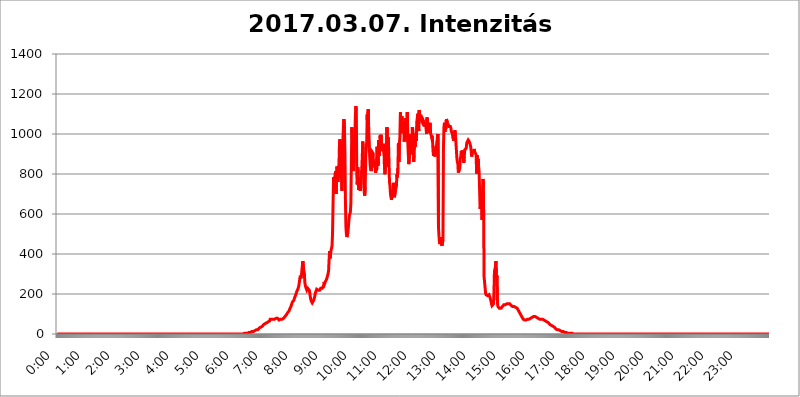
| Category | 2017.03.07. Intenzitás [W/m^2]07 |
|---|---|
| 0.0 | 0 |
| 0.0006944444444444445 | 0 |
| 0.001388888888888889 | 0 |
| 0.0020833333333333333 | 0 |
| 0.002777777777777778 | 0 |
| 0.003472222222222222 | 0 |
| 0.004166666666666667 | 0 |
| 0.004861111111111111 | 0 |
| 0.005555555555555556 | 0 |
| 0.0062499999999999995 | 0 |
| 0.006944444444444444 | 0 |
| 0.007638888888888889 | 0 |
| 0.008333333333333333 | 0 |
| 0.009027777777777779 | 0 |
| 0.009722222222222222 | 0 |
| 0.010416666666666666 | 0 |
| 0.011111111111111112 | 0 |
| 0.011805555555555555 | 0 |
| 0.012499999999999999 | 0 |
| 0.013194444444444444 | 0 |
| 0.013888888888888888 | 0 |
| 0.014583333333333332 | 0 |
| 0.015277777777777777 | 0 |
| 0.015972222222222224 | 0 |
| 0.016666666666666666 | 0 |
| 0.017361111111111112 | 0 |
| 0.018055555555555557 | 0 |
| 0.01875 | 0 |
| 0.019444444444444445 | 0 |
| 0.02013888888888889 | 0 |
| 0.020833333333333332 | 0 |
| 0.02152777777777778 | 0 |
| 0.022222222222222223 | 0 |
| 0.02291666666666667 | 0 |
| 0.02361111111111111 | 0 |
| 0.024305555555555556 | 0 |
| 0.024999999999999998 | 0 |
| 0.025694444444444447 | 0 |
| 0.02638888888888889 | 0 |
| 0.027083333333333334 | 0 |
| 0.027777777777777776 | 0 |
| 0.02847222222222222 | 0 |
| 0.029166666666666664 | 0 |
| 0.029861111111111113 | 0 |
| 0.030555555555555555 | 0 |
| 0.03125 | 0 |
| 0.03194444444444445 | 0 |
| 0.03263888888888889 | 0 |
| 0.03333333333333333 | 0 |
| 0.034027777777777775 | 0 |
| 0.034722222222222224 | 0 |
| 0.035416666666666666 | 0 |
| 0.036111111111111115 | 0 |
| 0.03680555555555556 | 0 |
| 0.0375 | 0 |
| 0.03819444444444444 | 0 |
| 0.03888888888888889 | 0 |
| 0.03958333333333333 | 0 |
| 0.04027777777777778 | 0 |
| 0.04097222222222222 | 0 |
| 0.041666666666666664 | 0 |
| 0.042361111111111106 | 0 |
| 0.04305555555555556 | 0 |
| 0.043750000000000004 | 0 |
| 0.044444444444444446 | 0 |
| 0.04513888888888889 | 0 |
| 0.04583333333333334 | 0 |
| 0.04652777777777778 | 0 |
| 0.04722222222222222 | 0 |
| 0.04791666666666666 | 0 |
| 0.04861111111111111 | 0 |
| 0.049305555555555554 | 0 |
| 0.049999999999999996 | 0 |
| 0.05069444444444445 | 0 |
| 0.051388888888888894 | 0 |
| 0.052083333333333336 | 0 |
| 0.05277777777777778 | 0 |
| 0.05347222222222222 | 0 |
| 0.05416666666666667 | 0 |
| 0.05486111111111111 | 0 |
| 0.05555555555555555 | 0 |
| 0.05625 | 0 |
| 0.05694444444444444 | 0 |
| 0.057638888888888885 | 0 |
| 0.05833333333333333 | 0 |
| 0.05902777777777778 | 0 |
| 0.059722222222222225 | 0 |
| 0.06041666666666667 | 0 |
| 0.061111111111111116 | 0 |
| 0.06180555555555556 | 0 |
| 0.0625 | 0 |
| 0.06319444444444444 | 0 |
| 0.06388888888888888 | 0 |
| 0.06458333333333334 | 0 |
| 0.06527777777777778 | 0 |
| 0.06597222222222222 | 0 |
| 0.06666666666666667 | 0 |
| 0.06736111111111111 | 0 |
| 0.06805555555555555 | 0 |
| 0.06874999999999999 | 0 |
| 0.06944444444444443 | 0 |
| 0.07013888888888889 | 0 |
| 0.07083333333333333 | 0 |
| 0.07152777777777779 | 0 |
| 0.07222222222222223 | 0 |
| 0.07291666666666667 | 0 |
| 0.07361111111111111 | 0 |
| 0.07430555555555556 | 0 |
| 0.075 | 0 |
| 0.07569444444444444 | 0 |
| 0.0763888888888889 | 0 |
| 0.07708333333333334 | 0 |
| 0.07777777777777778 | 0 |
| 0.07847222222222222 | 0 |
| 0.07916666666666666 | 0 |
| 0.0798611111111111 | 0 |
| 0.08055555555555556 | 0 |
| 0.08125 | 0 |
| 0.08194444444444444 | 0 |
| 0.08263888888888889 | 0 |
| 0.08333333333333333 | 0 |
| 0.08402777777777777 | 0 |
| 0.08472222222222221 | 0 |
| 0.08541666666666665 | 0 |
| 0.08611111111111112 | 0 |
| 0.08680555555555557 | 0 |
| 0.08750000000000001 | 0 |
| 0.08819444444444445 | 0 |
| 0.08888888888888889 | 0 |
| 0.08958333333333333 | 0 |
| 0.09027777777777778 | 0 |
| 0.09097222222222222 | 0 |
| 0.09166666666666667 | 0 |
| 0.09236111111111112 | 0 |
| 0.09305555555555556 | 0 |
| 0.09375 | 0 |
| 0.09444444444444444 | 0 |
| 0.09513888888888888 | 0 |
| 0.09583333333333333 | 0 |
| 0.09652777777777777 | 0 |
| 0.09722222222222222 | 0 |
| 0.09791666666666667 | 0 |
| 0.09861111111111111 | 0 |
| 0.09930555555555555 | 0 |
| 0.09999999999999999 | 0 |
| 0.10069444444444443 | 0 |
| 0.1013888888888889 | 0 |
| 0.10208333333333335 | 0 |
| 0.10277777777777779 | 0 |
| 0.10347222222222223 | 0 |
| 0.10416666666666667 | 0 |
| 0.10486111111111111 | 0 |
| 0.10555555555555556 | 0 |
| 0.10625 | 0 |
| 0.10694444444444444 | 0 |
| 0.1076388888888889 | 0 |
| 0.10833333333333334 | 0 |
| 0.10902777777777778 | 0 |
| 0.10972222222222222 | 0 |
| 0.1111111111111111 | 0 |
| 0.11180555555555556 | 0 |
| 0.11180555555555556 | 0 |
| 0.1125 | 0 |
| 0.11319444444444444 | 0 |
| 0.11388888888888889 | 0 |
| 0.11458333333333333 | 0 |
| 0.11527777777777777 | 0 |
| 0.11597222222222221 | 0 |
| 0.11666666666666665 | 0 |
| 0.1173611111111111 | 0 |
| 0.11805555555555557 | 0 |
| 0.11944444444444445 | 0 |
| 0.12013888888888889 | 0 |
| 0.12083333333333333 | 0 |
| 0.12152777777777778 | 0 |
| 0.12222222222222223 | 0 |
| 0.12291666666666667 | 0 |
| 0.12291666666666667 | 0 |
| 0.12361111111111112 | 0 |
| 0.12430555555555556 | 0 |
| 0.125 | 0 |
| 0.12569444444444444 | 0 |
| 0.12638888888888888 | 0 |
| 0.12708333333333333 | 0 |
| 0.16875 | 0 |
| 0.12847222222222224 | 0 |
| 0.12916666666666668 | 0 |
| 0.12986111111111112 | 0 |
| 0.13055555555555556 | 0 |
| 0.13125 | 0 |
| 0.13194444444444445 | 0 |
| 0.1326388888888889 | 0 |
| 0.13333333333333333 | 0 |
| 0.13402777777777777 | 0 |
| 0.13402777777777777 | 0 |
| 0.13472222222222222 | 0 |
| 0.13541666666666666 | 0 |
| 0.1361111111111111 | 0 |
| 0.13749999999999998 | 0 |
| 0.13819444444444443 | 0 |
| 0.1388888888888889 | 0 |
| 0.13958333333333334 | 0 |
| 0.14027777777777778 | 0 |
| 0.14097222222222222 | 0 |
| 0.14166666666666666 | 0 |
| 0.1423611111111111 | 0 |
| 0.14305555555555557 | 0 |
| 0.14375000000000002 | 0 |
| 0.14444444444444446 | 0 |
| 0.1451388888888889 | 0 |
| 0.1451388888888889 | 0 |
| 0.14652777777777778 | 0 |
| 0.14722222222222223 | 0 |
| 0.14791666666666667 | 0 |
| 0.1486111111111111 | 0 |
| 0.14930555555555555 | 0 |
| 0.15 | 0 |
| 0.15069444444444444 | 0 |
| 0.15138888888888888 | 0 |
| 0.15208333333333332 | 0 |
| 0.15277777777777776 | 0 |
| 0.15347222222222223 | 0 |
| 0.15416666666666667 | 0 |
| 0.15486111111111112 | 0 |
| 0.15555555555555556 | 0 |
| 0.15625 | 0 |
| 0.15694444444444444 | 0 |
| 0.15763888888888888 | 0 |
| 0.15833333333333333 | 0 |
| 0.15902777777777777 | 0 |
| 0.15972222222222224 | 0 |
| 0.16041666666666668 | 0 |
| 0.16111111111111112 | 0 |
| 0.16180555555555556 | 0 |
| 0.1625 | 0 |
| 0.16319444444444445 | 0 |
| 0.1638888888888889 | 0 |
| 0.16458333333333333 | 0 |
| 0.16527777777777777 | 0 |
| 0.16597222222222222 | 0 |
| 0.16666666666666666 | 0 |
| 0.1673611111111111 | 0 |
| 0.16805555555555554 | 0 |
| 0.16874999999999998 | 0 |
| 0.16944444444444443 | 0 |
| 0.17013888888888887 | 0 |
| 0.1708333333333333 | 0 |
| 0.17152777777777775 | 0 |
| 0.17222222222222225 | 0 |
| 0.1729166666666667 | 0 |
| 0.17361111111111113 | 0 |
| 0.17430555555555557 | 0 |
| 0.17500000000000002 | 0 |
| 0.17569444444444446 | 0 |
| 0.1763888888888889 | 0 |
| 0.17708333333333334 | 0 |
| 0.17777777777777778 | 0 |
| 0.17847222222222223 | 0 |
| 0.17916666666666667 | 0 |
| 0.1798611111111111 | 0 |
| 0.18055555555555555 | 0 |
| 0.18125 | 0 |
| 0.18194444444444444 | 0 |
| 0.1826388888888889 | 0 |
| 0.18333333333333335 | 0 |
| 0.1840277777777778 | 0 |
| 0.18472222222222223 | 0 |
| 0.18541666666666667 | 0 |
| 0.18611111111111112 | 0 |
| 0.18680555555555556 | 0 |
| 0.1875 | 0 |
| 0.18819444444444444 | 0 |
| 0.18888888888888888 | 0 |
| 0.18958333333333333 | 0 |
| 0.19027777777777777 | 0 |
| 0.1909722222222222 | 0 |
| 0.19166666666666665 | 0 |
| 0.19236111111111112 | 0 |
| 0.19305555555555554 | 0 |
| 0.19375 | 0 |
| 0.19444444444444445 | 0 |
| 0.1951388888888889 | 0 |
| 0.19583333333333333 | 0 |
| 0.19652777777777777 | 0 |
| 0.19722222222222222 | 0 |
| 0.19791666666666666 | 0 |
| 0.1986111111111111 | 0 |
| 0.19930555555555554 | 0 |
| 0.19999999999999998 | 0 |
| 0.20069444444444443 | 0 |
| 0.20138888888888887 | 0 |
| 0.2020833333333333 | 0 |
| 0.2027777777777778 | 0 |
| 0.2034722222222222 | 0 |
| 0.2041666666666667 | 0 |
| 0.20486111111111113 | 0 |
| 0.20555555555555557 | 0 |
| 0.20625000000000002 | 0 |
| 0.20694444444444446 | 0 |
| 0.2076388888888889 | 0 |
| 0.20833333333333334 | 0 |
| 0.20902777777777778 | 0 |
| 0.20972222222222223 | 0 |
| 0.21041666666666667 | 0 |
| 0.2111111111111111 | 0 |
| 0.21180555555555555 | 0 |
| 0.2125 | 0 |
| 0.21319444444444444 | 0 |
| 0.2138888888888889 | 0 |
| 0.21458333333333335 | 0 |
| 0.2152777777777778 | 0 |
| 0.21597222222222223 | 0 |
| 0.21666666666666667 | 0 |
| 0.21736111111111112 | 0 |
| 0.21805555555555556 | 0 |
| 0.21875 | 0 |
| 0.21944444444444444 | 0 |
| 0.22013888888888888 | 0 |
| 0.22083333333333333 | 0 |
| 0.22152777777777777 | 0 |
| 0.2222222222222222 | 0 |
| 0.22291666666666665 | 0 |
| 0.2236111111111111 | 0 |
| 0.22430555555555556 | 0 |
| 0.225 | 0 |
| 0.22569444444444445 | 0 |
| 0.2263888888888889 | 0 |
| 0.22708333333333333 | 0 |
| 0.22777777777777777 | 0 |
| 0.22847222222222222 | 0 |
| 0.22916666666666666 | 0 |
| 0.2298611111111111 | 0 |
| 0.23055555555555554 | 0 |
| 0.23124999999999998 | 0 |
| 0.23194444444444443 | 0 |
| 0.23263888888888887 | 0 |
| 0.2333333333333333 | 0 |
| 0.2340277777777778 | 0 |
| 0.2347222222222222 | 0 |
| 0.2354166666666667 | 0 |
| 0.23611111111111113 | 0 |
| 0.23680555555555557 | 0 |
| 0.23750000000000002 | 0 |
| 0.23819444444444446 | 0 |
| 0.2388888888888889 | 0 |
| 0.23958333333333334 | 0 |
| 0.24027777777777778 | 0 |
| 0.24097222222222223 | 0 |
| 0.24166666666666667 | 0 |
| 0.2423611111111111 | 0 |
| 0.24305555555555555 | 0 |
| 0.24375 | 0 |
| 0.24444444444444446 | 0 |
| 0.24513888888888888 | 0 |
| 0.24583333333333335 | 0 |
| 0.2465277777777778 | 0 |
| 0.24722222222222223 | 0 |
| 0.24791666666666667 | 0 |
| 0.24861111111111112 | 0 |
| 0.24930555555555556 | 0 |
| 0.25 | 0 |
| 0.25069444444444444 | 0 |
| 0.2513888888888889 | 0 |
| 0.2520833333333333 | 0 |
| 0.25277777777777777 | 0 |
| 0.2534722222222222 | 0 |
| 0.25416666666666665 | 0 |
| 0.2548611111111111 | 0 |
| 0.2555555555555556 | 0 |
| 0.25625000000000003 | 0 |
| 0.2569444444444445 | 0 |
| 0.2576388888888889 | 0 |
| 0.25833333333333336 | 0 |
| 0.2590277777777778 | 0 |
| 0.25972222222222224 | 0 |
| 0.2604166666666667 | 0 |
| 0.2611111111111111 | 0 |
| 0.26180555555555557 | 0 |
| 0.2625 | 3.525 |
| 0.26319444444444445 | 3.525 |
| 0.2638888888888889 | 3.525 |
| 0.26458333333333334 | 3.525 |
| 0.2652777777777778 | 3.525 |
| 0.2659722222222222 | 3.525 |
| 0.26666666666666666 | 3.525 |
| 0.2673611111111111 | 7.887 |
| 0.26805555555555555 | 7.887 |
| 0.26875 | 7.887 |
| 0.26944444444444443 | 7.887 |
| 0.2701388888888889 | 7.887 |
| 0.2708333333333333 | 7.887 |
| 0.27152777777777776 | 7.887 |
| 0.2722222222222222 | 7.887 |
| 0.27291666666666664 | 12.257 |
| 0.2736111111111111 | 12.257 |
| 0.2743055555555555 | 12.257 |
| 0.27499999999999997 | 12.257 |
| 0.27569444444444446 | 12.257 |
| 0.27638888888888885 | 12.257 |
| 0.27708333333333335 | 16.636 |
| 0.2777777777777778 | 16.636 |
| 0.27847222222222223 | 16.636 |
| 0.2791666666666667 | 21.024 |
| 0.2798611111111111 | 21.024 |
| 0.28055555555555556 | 21.024 |
| 0.28125 | 21.024 |
| 0.28194444444444444 | 25.419 |
| 0.2826388888888889 | 25.419 |
| 0.2833333333333333 | 29.823 |
| 0.28402777777777777 | 29.823 |
| 0.2847222222222222 | 29.823 |
| 0.28541666666666665 | 34.234 |
| 0.28611111111111115 | 34.234 |
| 0.28680555555555554 | 38.653 |
| 0.28750000000000003 | 38.653 |
| 0.2881944444444445 | 43.079 |
| 0.2888888888888889 | 43.079 |
| 0.28958333333333336 | 47.511 |
| 0.2902777777777778 | 47.511 |
| 0.29097222222222224 | 47.511 |
| 0.2916666666666667 | 51.951 |
| 0.2923611111111111 | 51.951 |
| 0.29305555555555557 | 56.398 |
| 0.29375 | 56.398 |
| 0.29444444444444445 | 56.398 |
| 0.2951388888888889 | 60.85 |
| 0.29583333333333334 | 60.85 |
| 0.2965277777777778 | 60.85 |
| 0.2972222222222222 | 65.31 |
| 0.29791666666666666 | 65.31 |
| 0.2986111111111111 | 74.246 |
| 0.29930555555555555 | 78.722 |
| 0.3 | 78.722 |
| 0.30069444444444443 | 74.246 |
| 0.3013888888888889 | 74.246 |
| 0.3020833333333333 | 74.246 |
| 0.30277777777777776 | 74.246 |
| 0.3034722222222222 | 74.246 |
| 0.30416666666666664 | 74.246 |
| 0.3048611111111111 | 74.246 |
| 0.3055555555555555 | 74.246 |
| 0.30624999999999997 | 74.246 |
| 0.3069444444444444 | 78.722 |
| 0.3076388888888889 | 78.722 |
| 0.30833333333333335 | 78.722 |
| 0.3090277777777778 | 78.722 |
| 0.30972222222222223 | 83.205 |
| 0.3104166666666667 | 74.246 |
| 0.3111111111111111 | 69.775 |
| 0.31180555555555556 | 69.775 |
| 0.3125 | 69.775 |
| 0.31319444444444444 | 74.246 |
| 0.3138888888888889 | 74.246 |
| 0.3145833333333333 | 74.246 |
| 0.31527777777777777 | 74.246 |
| 0.3159722222222222 | 74.246 |
| 0.31666666666666665 | 74.246 |
| 0.31736111111111115 | 78.722 |
| 0.31805555555555554 | 83.205 |
| 0.31875000000000003 | 83.205 |
| 0.3194444444444445 | 87.692 |
| 0.3201388888888889 | 92.184 |
| 0.32083333333333336 | 92.184 |
| 0.3215277777777778 | 96.682 |
| 0.32222222222222224 | 101.184 |
| 0.3229166666666667 | 105.69 |
| 0.3236111111111111 | 105.69 |
| 0.32430555555555557 | 110.201 |
| 0.325 | 114.716 |
| 0.32569444444444445 | 119.235 |
| 0.3263888888888889 | 128.284 |
| 0.32708333333333334 | 132.814 |
| 0.3277777777777778 | 137.347 |
| 0.3284722222222222 | 146.423 |
| 0.32916666666666666 | 150.964 |
| 0.3298611111111111 | 160.056 |
| 0.33055555555555555 | 164.605 |
| 0.33125 | 164.605 |
| 0.33194444444444443 | 169.156 |
| 0.3326388888888889 | 178.264 |
| 0.3333333333333333 | 182.82 |
| 0.3340277777777778 | 191.937 |
| 0.3347222222222222 | 196.497 |
| 0.3354166666666667 | 205.62 |
| 0.3361111111111111 | 214.746 |
| 0.3368055555555556 | 219.309 |
| 0.33749999999999997 | 223.873 |
| 0.33819444444444446 | 228.436 |
| 0.33888888888888885 | 242.127 |
| 0.33958333333333335 | 260.373 |
| 0.34027777777777773 | 278.603 |
| 0.34097222222222223 | 292.259 |
| 0.3416666666666666 | 278.603 |
| 0.3423611111111111 | 287.709 |
| 0.3430555555555555 | 314.98 |
| 0.34375 | 342.162 |
| 0.3444444444444445 | 364.728 |
| 0.3451388888888889 | 342.162 |
| 0.3458333333333334 | 314.98 |
| 0.34652777777777777 | 305.898 |
| 0.34722222222222227 | 260.373 |
| 0.34791666666666665 | 242.127 |
| 0.34861111111111115 | 233 |
| 0.34930555555555554 | 228.436 |
| 0.35000000000000003 | 219.309 |
| 0.3506944444444444 | 219.309 |
| 0.3513888888888889 | 228.436 |
| 0.3520833333333333 | 233 |
| 0.3527777777777778 | 228.436 |
| 0.3534722222222222 | 219.309 |
| 0.3541666666666667 | 205.62 |
| 0.3548611111111111 | 187.378 |
| 0.35555555555555557 | 173.709 |
| 0.35625 | 164.605 |
| 0.35694444444444445 | 160.056 |
| 0.3576388888888889 | 155.509 |
| 0.35833333333333334 | 155.509 |
| 0.3590277777777778 | 160.056 |
| 0.3597222222222222 | 169.156 |
| 0.36041666666666666 | 173.709 |
| 0.3611111111111111 | 187.378 |
| 0.36180555555555555 | 201.058 |
| 0.3625 | 210.182 |
| 0.36319444444444443 | 214.746 |
| 0.3638888888888889 | 223.873 |
| 0.3645833333333333 | 219.309 |
| 0.3652777777777778 | 223.873 |
| 0.3659722222222222 | 219.309 |
| 0.3666666666666667 | 219.309 |
| 0.3673611111111111 | 219.309 |
| 0.3680555555555556 | 219.309 |
| 0.36874999999999997 | 223.873 |
| 0.36944444444444446 | 228.436 |
| 0.37013888888888885 | 228.436 |
| 0.37083333333333335 | 228.436 |
| 0.37152777777777773 | 228.436 |
| 0.37222222222222223 | 233 |
| 0.3729166666666666 | 233 |
| 0.3736111111111111 | 242.127 |
| 0.3743055555555555 | 260.373 |
| 0.375 | 251.251 |
| 0.3756944444444445 | 255.813 |
| 0.3763888888888889 | 264.932 |
| 0.3770833333333334 | 269.49 |
| 0.37777777777777777 | 274.047 |
| 0.37847222222222227 | 283.156 |
| 0.37916666666666665 | 292.259 |
| 0.37986111111111115 | 301.354 |
| 0.38055555555555554 | 314.98 |
| 0.38125000000000003 | 369.23 |
| 0.3819444444444444 | 414.035 |
| 0.3826388888888889 | 378.224 |
| 0.3833333333333333 | 400.638 |
| 0.3840277777777778 | 418.492 |
| 0.3847222222222222 | 418.492 |
| 0.3854166666666667 | 440.702 |
| 0.3861111111111111 | 506.542 |
| 0.38680555555555557 | 646.537 |
| 0.3875 | 783.342 |
| 0.38819444444444445 | 779.42 |
| 0.3888888888888889 | 747.834 |
| 0.38958333333333334 | 743.859 |
| 0.3902777777777778 | 814.519 |
| 0.3909722222222222 | 699.717 |
| 0.39166666666666666 | 771.559 |
| 0.3923611111111111 | 837.682 |
| 0.39305555555555555 | 779.42 |
| 0.39375 | 759.723 |
| 0.39444444444444443 | 755.766 |
| 0.3951388888888889 | 845.365 |
| 0.3958333333333333 | 955.071 |
| 0.3965277777777778 | 973.772 |
| 0.3972222222222222 | 970.034 |
| 0.3979166666666667 | 902.447 |
| 0.3986111111111111 | 795.074 |
| 0.3993055555555556 | 715.858 |
| 0.39999999999999997 | 829.981 |
| 0.40069444444444446 | 973.772 |
| 0.40138888888888885 | 1037.277 |
| 0.40208333333333335 | 1074.789 |
| 0.40277777777777773 | 1029.798 |
| 0.40347222222222223 | 917.534 |
| 0.4041666666666666 | 671.22 |
| 0.4048611111111111 | 536.82 |
| 0.4055555555555555 | 497.836 |
| 0.40625 | 484.735 |
| 0.4069444444444445 | 489.108 |
| 0.4076388888888889 | 506.542 |
| 0.4083333333333334 | 536.82 |
| 0.40902777777777777 | 566.793 |
| 0.40972222222222227 | 592.233 |
| 0.41041666666666665 | 600.661 |
| 0.41111111111111115 | 609.062 |
| 0.41180555555555554 | 654.791 |
| 0.41250000000000003 | 856.855 |
| 0.4131944444444444 | 1033.537 |
| 0.4138888888888889 | 977.508 |
| 0.4145833333333333 | 845.365 |
| 0.4152777777777778 | 814.519 |
| 0.4159722222222222 | 879.719 |
| 0.4166666666666667 | 925.06 |
| 0.4173611111111111 | 988.714 |
| 0.41805555555555557 | 1078.555 |
| 0.41875 | 1139.384 |
| 0.41944444444444445 | 1120.238 |
| 0.4201388888888889 | 795.074 |
| 0.42083333333333334 | 747.834 |
| 0.4215277777777778 | 833.834 |
| 0.4222222222222222 | 763.674 |
| 0.42291666666666666 | 719.877 |
| 0.4236111111111111 | 783.342 |
| 0.42430555555555555 | 743.859 |
| 0.425 | 715.858 |
| 0.42569444444444443 | 735.89 |
| 0.4263888888888889 | 791.169 |
| 0.4270833333333333 | 826.123 |
| 0.4277777777777778 | 883.516 |
| 0.4284722222222222 | 962.555 |
| 0.4291666666666667 | 925.06 |
| 0.4298611111111111 | 763.674 |
| 0.4305555555555556 | 707.8 |
| 0.43124999999999997 | 691.608 |
| 0.43194444444444446 | 735.89 |
| 0.43263888888888885 | 891.099 |
| 0.43333333333333335 | 887.309 |
| 0.43402777777777773 | 958.814 |
| 0.43472222222222223 | 1097.437 |
| 0.4354166666666666 | 1018.587 |
| 0.4361111111111111 | 1124.056 |
| 0.4368055555555555 | 1022.323 |
| 0.4375 | 966.295 |
| 0.4381944444444445 | 887.309 |
| 0.4388888888888889 | 845.365 |
| 0.4395833333333334 | 822.26 |
| 0.44027777777777777 | 814.519 |
| 0.44097222222222227 | 837.682 |
| 0.44166666666666665 | 909.996 |
| 0.44236111111111115 | 909.996 |
| 0.44305555555555554 | 902.447 |
| 0.44375000000000003 | 837.682 |
| 0.4444444444444444 | 845.365 |
| 0.4451388888888889 | 864.493 |
| 0.4458333333333333 | 829.981 |
| 0.4465277777777778 | 806.757 |
| 0.4472222222222222 | 849.199 |
| 0.4479166666666667 | 818.392 |
| 0.4486111111111111 | 936.33 |
| 0.44930555555555557 | 925.06 |
| 0.45 | 841.526 |
| 0.45069444444444445 | 970.034 |
| 0.4513888888888889 | 891.099 |
| 0.45208333333333334 | 909.996 |
| 0.4527777777777778 | 992.448 |
| 0.4534722222222222 | 970.034 |
| 0.45416666666666666 | 996.182 |
| 0.4548611111111111 | 940.082 |
| 0.45555555555555555 | 913.766 |
| 0.45625 | 909.996 |
| 0.45694444444444443 | 925.06 |
| 0.4576388888888889 | 951.327 |
| 0.4583333333333333 | 902.447 |
| 0.4590277777777778 | 826.123 |
| 0.4597222222222222 | 798.974 |
| 0.4604166666666667 | 860.676 |
| 0.4611111111111111 | 932.576 |
| 0.4618055555555556 | 872.114 |
| 0.46249999999999997 | 1033.537 |
| 0.46319444444444446 | 837.682 |
| 0.46388888888888885 | 984.98 |
| 0.46458333333333335 | 962.555 |
| 0.46527777777777773 | 856.855 |
| 0.46597222222222223 | 759.723 |
| 0.4666666666666666 | 739.877 |
| 0.4673611111111111 | 699.717 |
| 0.4680555555555555 | 683.473 |
| 0.46875 | 671.22 |
| 0.4694444444444445 | 687.544 |
| 0.4701388888888889 | 711.832 |
| 0.4708333333333334 | 727.896 |
| 0.47152777777777777 | 755.766 |
| 0.47222222222222227 | 699.717 |
| 0.47291666666666665 | 683.473 |
| 0.47361111111111115 | 683.473 |
| 0.47430555555555554 | 719.877 |
| 0.47500000000000003 | 723.889 |
| 0.4756944444444444 | 739.877 |
| 0.4763888888888889 | 798.974 |
| 0.4770833333333333 | 783.342 |
| 0.4777777777777778 | 829.981 |
| 0.4784722222222222 | 955.071 |
| 0.4791666666666667 | 860.676 |
| 0.4798611111111111 | 955.071 |
| 0.48055555555555557 | 981.244 |
| 0.48125 | 1108.816 |
| 0.48194444444444445 | 1003.65 |
| 0.4826388888888889 | 999.916 |
| 0.48333333333333334 | 1089.873 |
| 0.4840277777777778 | 1037.277 |
| 0.4847222222222222 | 1007.383 |
| 0.48541666666666666 | 1052.255 |
| 0.4861111111111111 | 1063.51 |
| 0.48680555555555555 | 962.555 |
| 0.4875 | 1029.798 |
| 0.48819444444444443 | 1078.555 |
| 0.4888888888888889 | 1018.587 |
| 0.4895833333333333 | 1029.798 |
| 0.4902777777777778 | 973.772 |
| 0.4909722222222222 | 1108.816 |
| 0.4916666666666667 | 958.814 |
| 0.4923611111111111 | 898.668 |
| 0.4930555555555556 | 849.199 |
| 0.49374999999999997 | 872.114 |
| 0.49444444444444446 | 902.447 |
| 0.49513888888888885 | 999.916 |
| 0.49583333333333335 | 999.916 |
| 0.49652777777777773 | 898.668 |
| 0.49722222222222223 | 925.06 |
| 0.4979166666666666 | 1033.537 |
| 0.4986111111111111 | 1022.323 |
| 0.4993055555555555 | 996.182 |
| 0.5 | 860.676 |
| 0.5006944444444444 | 940.082 |
| 0.5013888888888889 | 951.327 |
| 0.5020833333333333 | 936.33 |
| 0.5027777777777778 | 1003.65 |
| 0.5034722222222222 | 966.295 |
| 0.5041666666666667 | 970.034 |
| 0.5048611111111111 | 1074.789 |
| 0.5055555555555555 | 1101.226 |
| 0.50625 | 1101.226 |
| 0.5069444444444444 | 1014.852 |
| 0.5076388888888889 | 1120.238 |
| 0.5083333333333333 | 1074.789 |
| 0.5090277777777777 | 1097.437 |
| 0.5097222222222222 | 1067.267 |
| 0.5104166666666666 | 1082.324 |
| 0.5111111111111112 | 1071.027 |
| 0.5118055555555555 | 1063.51 |
| 0.5125000000000001 | 1074.789 |
| 0.5131944444444444 | 1071.027 |
| 0.513888888888889 | 1074.789 |
| 0.5145833333333333 | 1059.756 |
| 0.5152777777777778 | 1037.277 |
| 0.5159722222222222 | 1056.004 |
| 0.5166666666666667 | 1048.508 |
| 0.517361111111111 | 1048.508 |
| 0.5180555555555556 | 999.916 |
| 0.5187499999999999 | 1082.324 |
| 0.5194444444444445 | 1037.277 |
| 0.5201388888888888 | 1052.255 |
| 0.5208333333333334 | 1007.383 |
| 0.5215277777777778 | 1011.118 |
| 0.5222222222222223 | 1037.277 |
| 0.5229166666666667 | 1056.004 |
| 0.5236111111111111 | 1003.65 |
| 0.5243055555555556 | 996.182 |
| 0.525 | 984.98 |
| 0.5256944444444445 | 992.448 |
| 0.5263888888888889 | 962.555 |
| 0.5270833333333333 | 913.766 |
| 0.5277777777777778 | 891.099 |
| 0.5284722222222222 | 921.298 |
| 0.5291666666666667 | 906.223 |
| 0.5298611111111111 | 887.309 |
| 0.5305555555555556 | 917.534 |
| 0.53125 | 940.082 |
| 0.5319444444444444 | 913.766 |
| 0.5326388888888889 | 962.555 |
| 0.5333333333333333 | 992.448 |
| 0.5340277777777778 | 999.916 |
| 0.5347222222222222 | 532.513 |
| 0.5354166666666667 | 489.108 |
| 0.5361111111111111 | 458.38 |
| 0.5368055555555555 | 449.551 |
| 0.5375 | 453.968 |
| 0.5381944444444444 | 484.735 |
| 0.5388888888888889 | 449.551 |
| 0.5395833333333333 | 440.702 |
| 0.5402777777777777 | 445.129 |
| 0.5409722222222222 | 471.582 |
| 0.5416666666666666 | 928.819 |
| 0.5423611111111112 | 1033.537 |
| 0.5430555555555555 | 1056.004 |
| 0.5437500000000001 | 1011.118 |
| 0.5444444444444444 | 1037.277 |
| 0.545138888888889 | 1026.06 |
| 0.5458333333333333 | 1074.789 |
| 0.5465277777777778 | 1071.027 |
| 0.5472222222222222 | 1056.004 |
| 0.5479166666666667 | 1059.756 |
| 0.548611111111111 | 1044.762 |
| 0.5493055555555556 | 1037.277 |
| 0.5499999999999999 | 1037.277 |
| 0.5506944444444445 | 1033.537 |
| 0.5513888888888888 | 1037.277 |
| 0.5520833333333334 | 1029.798 |
| 0.5527777777777778 | 1011.118 |
| 0.5534722222222223 | 1014.852 |
| 0.5541666666666667 | 1003.65 |
| 0.5548611111111111 | 981.244 |
| 0.5555555555555556 | 981.244 |
| 0.55625 | 966.295 |
| 0.5569444444444445 | 1003.65 |
| 0.5576388888888889 | 1018.587 |
| 0.5583333333333333 | 999.916 |
| 0.5590277777777778 | 962.555 |
| 0.5597222222222222 | 925.06 |
| 0.5604166666666667 | 883.516 |
| 0.5611111111111111 | 860.676 |
| 0.5618055555555556 | 853.029 |
| 0.5625 | 806.757 |
| 0.5631944444444444 | 802.868 |
| 0.5638888888888889 | 822.26 |
| 0.5645833333333333 | 829.981 |
| 0.5652777777777778 | 875.918 |
| 0.5659722222222222 | 887.309 |
| 0.5666666666666667 | 913.766 |
| 0.5673611111111111 | 891.099 |
| 0.5680555555555555 | 917.534 |
| 0.56875 | 894.885 |
| 0.5694444444444444 | 906.223 |
| 0.5701388888888889 | 856.855 |
| 0.5708333333333333 | 887.309 |
| 0.5715277777777777 | 921.298 |
| 0.5722222222222222 | 925.06 |
| 0.5729166666666666 | 921.298 |
| 0.5736111111111112 | 928.819 |
| 0.5743055555555555 | 955.071 |
| 0.5750000000000001 | 955.071 |
| 0.5756944444444444 | 951.327 |
| 0.576388888888889 | 970.034 |
| 0.5770833333333333 | 970.034 |
| 0.5777777777777778 | 962.555 |
| 0.5784722222222222 | 962.555 |
| 0.5791666666666667 | 947.58 |
| 0.579861111111111 | 936.33 |
| 0.5805555555555556 | 913.766 |
| 0.5812499999999999 | 887.309 |
| 0.5819444444444445 | 906.223 |
| 0.5826388888888888 | 902.447 |
| 0.5833333333333334 | 902.447 |
| 0.5840277777777778 | 913.766 |
| 0.5847222222222223 | 925.06 |
| 0.5854166666666667 | 913.766 |
| 0.5861111111111111 | 917.534 |
| 0.5868055555555556 | 913.766 |
| 0.5875 | 894.885 |
| 0.5881944444444445 | 802.868 |
| 0.5888888888888889 | 894.885 |
| 0.5895833333333333 | 826.123 |
| 0.5902777777777778 | 875.918 |
| 0.5909722222222222 | 837.682 |
| 0.5916666666666667 | 810.641 |
| 0.5923611111111111 | 719.877 |
| 0.5930555555555556 | 625.784 |
| 0.59375 | 638.256 |
| 0.5944444444444444 | 675.311 |
| 0.5951388888888889 | 634.105 |
| 0.5958333333333333 | 571.049 |
| 0.5965277777777778 | 711.832 |
| 0.5972222222222222 | 775.492 |
| 0.5979166666666667 | 675.311 |
| 0.5986111111111111 | 287.709 |
| 0.5993055555555555 | 260.373 |
| 0.6 | 233 |
| 0.6006944444444444 | 205.62 |
| 0.6013888888888889 | 196.497 |
| 0.6020833333333333 | 191.937 |
| 0.6027777777777777 | 196.497 |
| 0.6034722222222222 | 191.937 |
| 0.6041666666666666 | 191.937 |
| 0.6048611111111112 | 191.937 |
| 0.6055555555555555 | 196.497 |
| 0.6062500000000001 | 191.937 |
| 0.6069444444444444 | 182.82 |
| 0.607638888888889 | 173.709 |
| 0.6083333333333333 | 164.605 |
| 0.6090277777777778 | 150.964 |
| 0.6097222222222222 | 141.884 |
| 0.6104166666666667 | 137.347 |
| 0.611111111111111 | 137.347 |
| 0.6118055555555556 | 150.964 |
| 0.6124999999999999 | 205.62 |
| 0.6131944444444445 | 314.98 |
| 0.6138888888888888 | 324.052 |
| 0.6145833333333334 | 337.639 |
| 0.6152777777777778 | 364.728 |
| 0.6159722222222223 | 278.603 |
| 0.6166666666666667 | 292.259 |
| 0.6173611111111111 | 155.509 |
| 0.6180555555555556 | 137.347 |
| 0.61875 | 132.814 |
| 0.6194444444444445 | 132.814 |
| 0.6201388888888889 | 128.284 |
| 0.6208333333333333 | 128.284 |
| 0.6215277777777778 | 128.284 |
| 0.6222222222222222 | 128.284 |
| 0.6229166666666667 | 132.814 |
| 0.6236111111111111 | 132.814 |
| 0.6243055555555556 | 137.347 |
| 0.625 | 141.884 |
| 0.6256944444444444 | 141.884 |
| 0.6263888888888889 | 146.423 |
| 0.6270833333333333 | 146.423 |
| 0.6277777777777778 | 146.423 |
| 0.6284722222222222 | 146.423 |
| 0.6291666666666667 | 146.423 |
| 0.6298611111111111 | 146.423 |
| 0.6305555555555555 | 150.964 |
| 0.63125 | 155.509 |
| 0.6319444444444444 | 155.509 |
| 0.6326388888888889 | 150.964 |
| 0.6333333333333333 | 150.964 |
| 0.6340277777777777 | 155.509 |
| 0.6347222222222222 | 150.964 |
| 0.6354166666666666 | 146.423 |
| 0.6361111111111112 | 146.423 |
| 0.6368055555555555 | 141.884 |
| 0.6375000000000001 | 141.884 |
| 0.6381944444444444 | 137.347 |
| 0.638888888888889 | 137.347 |
| 0.6395833333333333 | 137.347 |
| 0.6402777777777778 | 137.347 |
| 0.6409722222222222 | 137.347 |
| 0.6416666666666667 | 137.347 |
| 0.642361111111111 | 137.347 |
| 0.6430555555555556 | 132.814 |
| 0.6437499999999999 | 132.814 |
| 0.6444444444444445 | 128.284 |
| 0.6451388888888888 | 128.284 |
| 0.6458333333333334 | 123.758 |
| 0.6465277777777778 | 119.235 |
| 0.6472222222222223 | 114.716 |
| 0.6479166666666667 | 110.201 |
| 0.6486111111111111 | 110.201 |
| 0.6493055555555556 | 101.184 |
| 0.65 | 101.184 |
| 0.6506944444444445 | 92.184 |
| 0.6513888888888889 | 87.692 |
| 0.6520833333333333 | 83.205 |
| 0.6527777777777778 | 78.722 |
| 0.6534722222222222 | 74.246 |
| 0.6541666666666667 | 74.246 |
| 0.6548611111111111 | 69.775 |
| 0.6555555555555556 | 69.775 |
| 0.65625 | 69.775 |
| 0.6569444444444444 | 69.775 |
| 0.6576388888888889 | 69.775 |
| 0.6583333333333333 | 69.775 |
| 0.6590277777777778 | 69.775 |
| 0.6597222222222222 | 74.246 |
| 0.6604166666666667 | 74.246 |
| 0.6611111111111111 | 74.246 |
| 0.6618055555555555 | 74.246 |
| 0.6625 | 74.246 |
| 0.6631944444444444 | 74.246 |
| 0.6638888888888889 | 78.722 |
| 0.6645833333333333 | 78.722 |
| 0.6652777777777777 | 78.722 |
| 0.6659722222222222 | 83.205 |
| 0.6666666666666666 | 83.205 |
| 0.6673611111111111 | 87.692 |
| 0.6680555555555556 | 87.692 |
| 0.6687500000000001 | 87.692 |
| 0.6694444444444444 | 87.692 |
| 0.6701388888888888 | 87.692 |
| 0.6708333333333334 | 87.692 |
| 0.6715277777777778 | 87.692 |
| 0.6722222222222222 | 83.205 |
| 0.6729166666666666 | 83.205 |
| 0.6736111111111112 | 83.205 |
| 0.6743055555555556 | 78.722 |
| 0.6749999999999999 | 78.722 |
| 0.6756944444444444 | 78.722 |
| 0.6763888888888889 | 74.246 |
| 0.6770833333333334 | 74.246 |
| 0.6777777777777777 | 74.246 |
| 0.6784722222222223 | 74.246 |
| 0.6791666666666667 | 74.246 |
| 0.6798611111111111 | 74.246 |
| 0.6805555555555555 | 74.246 |
| 0.68125 | 69.775 |
| 0.6819444444444445 | 69.775 |
| 0.6826388888888889 | 69.775 |
| 0.6833333333333332 | 65.31 |
| 0.6840277777777778 | 65.31 |
| 0.6847222222222222 | 65.31 |
| 0.6854166666666667 | 65.31 |
| 0.686111111111111 | 60.85 |
| 0.6868055555555556 | 60.85 |
| 0.6875 | 56.398 |
| 0.6881944444444444 | 56.398 |
| 0.688888888888889 | 56.398 |
| 0.6895833333333333 | 51.951 |
| 0.6902777777777778 | 51.951 |
| 0.6909722222222222 | 47.511 |
| 0.6916666666666668 | 47.511 |
| 0.6923611111111111 | 47.511 |
| 0.6930555555555555 | 43.079 |
| 0.69375 | 43.079 |
| 0.6944444444444445 | 38.653 |
| 0.6951388888888889 | 38.653 |
| 0.6958333333333333 | 34.234 |
| 0.6965277777777777 | 34.234 |
| 0.6972222222222223 | 34.234 |
| 0.6979166666666666 | 29.823 |
| 0.6986111111111111 | 29.823 |
| 0.6993055555555556 | 25.419 |
| 0.7000000000000001 | 25.419 |
| 0.7006944444444444 | 25.419 |
| 0.7013888888888888 | 21.024 |
| 0.7020833333333334 | 21.024 |
| 0.7027777777777778 | 21.024 |
| 0.7034722222222222 | 21.024 |
| 0.7041666666666666 | 16.636 |
| 0.7048611111111112 | 16.636 |
| 0.7055555555555556 | 16.636 |
| 0.7062499999999999 | 12.257 |
| 0.7069444444444444 | 12.257 |
| 0.7076388888888889 | 12.257 |
| 0.7083333333333334 | 12.257 |
| 0.7090277777777777 | 12.257 |
| 0.7097222222222223 | 12.257 |
| 0.7104166666666667 | 7.887 |
| 0.7111111111111111 | 7.887 |
| 0.7118055555555555 | 7.887 |
| 0.7125 | 7.887 |
| 0.7131944444444445 | 7.887 |
| 0.7138888888888889 | 7.887 |
| 0.7145833333333332 | 7.887 |
| 0.7152777777777778 | 7.887 |
| 0.7159722222222222 | 3.525 |
| 0.7166666666666667 | 3.525 |
| 0.717361111111111 | 3.525 |
| 0.7180555555555556 | 3.525 |
| 0.71875 | 3.525 |
| 0.7194444444444444 | 3.525 |
| 0.720138888888889 | 3.525 |
| 0.7208333333333333 | 3.525 |
| 0.7215277777777778 | 3.525 |
| 0.7222222222222222 | 3.525 |
| 0.7229166666666668 | 0 |
| 0.7236111111111111 | 0 |
| 0.7243055555555555 | 0 |
| 0.725 | 0 |
| 0.7256944444444445 | 0 |
| 0.7263888888888889 | 0 |
| 0.7270833333333333 | 0 |
| 0.7277777777777777 | 0 |
| 0.7284722222222223 | 0 |
| 0.7291666666666666 | 0 |
| 0.7298611111111111 | 0 |
| 0.7305555555555556 | 0 |
| 0.7312500000000001 | 0 |
| 0.7319444444444444 | 0 |
| 0.7326388888888888 | 0 |
| 0.7333333333333334 | 0 |
| 0.7340277777777778 | 0 |
| 0.7347222222222222 | 0 |
| 0.7354166666666666 | 0 |
| 0.7361111111111112 | 0 |
| 0.7368055555555556 | 0 |
| 0.7374999999999999 | 0 |
| 0.7381944444444444 | 0 |
| 0.7388888888888889 | 0 |
| 0.7395833333333334 | 0 |
| 0.7402777777777777 | 0 |
| 0.7409722222222223 | 0 |
| 0.7416666666666667 | 0 |
| 0.7423611111111111 | 0 |
| 0.7430555555555555 | 0 |
| 0.74375 | 0 |
| 0.7444444444444445 | 0 |
| 0.7451388888888889 | 0 |
| 0.7458333333333332 | 0 |
| 0.7465277777777778 | 0 |
| 0.7472222222222222 | 0 |
| 0.7479166666666667 | 0 |
| 0.748611111111111 | 0 |
| 0.7493055555555556 | 0 |
| 0.75 | 0 |
| 0.7506944444444444 | 0 |
| 0.751388888888889 | 0 |
| 0.7520833333333333 | 0 |
| 0.7527777777777778 | 0 |
| 0.7534722222222222 | 0 |
| 0.7541666666666668 | 0 |
| 0.7548611111111111 | 0 |
| 0.7555555555555555 | 0 |
| 0.75625 | 0 |
| 0.7569444444444445 | 0 |
| 0.7576388888888889 | 0 |
| 0.7583333333333333 | 0 |
| 0.7590277777777777 | 0 |
| 0.7597222222222223 | 0 |
| 0.7604166666666666 | 0 |
| 0.7611111111111111 | 0 |
| 0.7618055555555556 | 0 |
| 0.7625000000000001 | 0 |
| 0.7631944444444444 | 0 |
| 0.7638888888888888 | 0 |
| 0.7645833333333334 | 0 |
| 0.7652777777777778 | 0 |
| 0.7659722222222222 | 0 |
| 0.7666666666666666 | 0 |
| 0.7673611111111112 | 0 |
| 0.7680555555555556 | 0 |
| 0.7687499999999999 | 0 |
| 0.7694444444444444 | 0 |
| 0.7701388888888889 | 0 |
| 0.7708333333333334 | 0 |
| 0.7715277777777777 | 0 |
| 0.7722222222222223 | 0 |
| 0.7729166666666667 | 0 |
| 0.7736111111111111 | 0 |
| 0.7743055555555555 | 0 |
| 0.775 | 0 |
| 0.7756944444444445 | 0 |
| 0.7763888888888889 | 0 |
| 0.7770833333333332 | 0 |
| 0.7777777777777778 | 0 |
| 0.7784722222222222 | 0 |
| 0.7791666666666667 | 0 |
| 0.779861111111111 | 0 |
| 0.7805555555555556 | 0 |
| 0.78125 | 0 |
| 0.7819444444444444 | 0 |
| 0.782638888888889 | 0 |
| 0.7833333333333333 | 0 |
| 0.7840277777777778 | 0 |
| 0.7847222222222222 | 0 |
| 0.7854166666666668 | 0 |
| 0.7861111111111111 | 0 |
| 0.7868055555555555 | 0 |
| 0.7875 | 0 |
| 0.7881944444444445 | 0 |
| 0.7888888888888889 | 0 |
| 0.7895833333333333 | 0 |
| 0.7902777777777777 | 0 |
| 0.7909722222222223 | 0 |
| 0.7916666666666666 | 0 |
| 0.7923611111111111 | 0 |
| 0.7930555555555556 | 0 |
| 0.7937500000000001 | 0 |
| 0.7944444444444444 | 0 |
| 0.7951388888888888 | 0 |
| 0.7958333333333334 | 0 |
| 0.7965277777777778 | 0 |
| 0.7972222222222222 | 0 |
| 0.7979166666666666 | 0 |
| 0.7986111111111112 | 0 |
| 0.7993055555555556 | 0 |
| 0.7999999999999999 | 0 |
| 0.8006944444444444 | 0 |
| 0.8013888888888889 | 0 |
| 0.8020833333333334 | 0 |
| 0.8027777777777777 | 0 |
| 0.8034722222222223 | 0 |
| 0.8041666666666667 | 0 |
| 0.8048611111111111 | 0 |
| 0.8055555555555555 | 0 |
| 0.80625 | 0 |
| 0.8069444444444445 | 0 |
| 0.8076388888888889 | 0 |
| 0.8083333333333332 | 0 |
| 0.8090277777777778 | 0 |
| 0.8097222222222222 | 0 |
| 0.8104166666666667 | 0 |
| 0.811111111111111 | 0 |
| 0.8118055555555556 | 0 |
| 0.8125 | 0 |
| 0.8131944444444444 | 0 |
| 0.813888888888889 | 0 |
| 0.8145833333333333 | 0 |
| 0.8152777777777778 | 0 |
| 0.8159722222222222 | 0 |
| 0.8166666666666668 | 0 |
| 0.8173611111111111 | 0 |
| 0.8180555555555555 | 0 |
| 0.81875 | 0 |
| 0.8194444444444445 | 0 |
| 0.8201388888888889 | 0 |
| 0.8208333333333333 | 0 |
| 0.8215277777777777 | 0 |
| 0.8222222222222223 | 0 |
| 0.8229166666666666 | 0 |
| 0.8236111111111111 | 0 |
| 0.8243055555555556 | 0 |
| 0.8250000000000001 | 0 |
| 0.8256944444444444 | 0 |
| 0.8263888888888888 | 0 |
| 0.8270833333333334 | 0 |
| 0.8277777777777778 | 0 |
| 0.8284722222222222 | 0 |
| 0.8291666666666666 | 0 |
| 0.8298611111111112 | 0 |
| 0.8305555555555556 | 0 |
| 0.8312499999999999 | 0 |
| 0.8319444444444444 | 0 |
| 0.8326388888888889 | 0 |
| 0.8333333333333334 | 0 |
| 0.8340277777777777 | 0 |
| 0.8347222222222223 | 0 |
| 0.8354166666666667 | 0 |
| 0.8361111111111111 | 0 |
| 0.8368055555555555 | 0 |
| 0.8375 | 0 |
| 0.8381944444444445 | 0 |
| 0.8388888888888889 | 0 |
| 0.8395833333333332 | 0 |
| 0.8402777777777778 | 0 |
| 0.8409722222222222 | 0 |
| 0.8416666666666667 | 0 |
| 0.842361111111111 | 0 |
| 0.8430555555555556 | 0 |
| 0.84375 | 0 |
| 0.8444444444444444 | 0 |
| 0.845138888888889 | 0 |
| 0.8458333333333333 | 0 |
| 0.8465277777777778 | 0 |
| 0.8472222222222222 | 0 |
| 0.8479166666666668 | 0 |
| 0.8486111111111111 | 0 |
| 0.8493055555555555 | 0 |
| 0.85 | 0 |
| 0.8506944444444445 | 0 |
| 0.8513888888888889 | 0 |
| 0.8520833333333333 | 0 |
| 0.8527777777777777 | 0 |
| 0.8534722222222223 | 0 |
| 0.8541666666666666 | 0 |
| 0.8548611111111111 | 0 |
| 0.8555555555555556 | 0 |
| 0.8562500000000001 | 0 |
| 0.8569444444444444 | 0 |
| 0.8576388888888888 | 0 |
| 0.8583333333333334 | 0 |
| 0.8590277777777778 | 0 |
| 0.8597222222222222 | 0 |
| 0.8604166666666666 | 0 |
| 0.8611111111111112 | 0 |
| 0.8618055555555556 | 0 |
| 0.8624999999999999 | 0 |
| 0.8631944444444444 | 0 |
| 0.8638888888888889 | 0 |
| 0.8645833333333334 | 0 |
| 0.8652777777777777 | 0 |
| 0.8659722222222223 | 0 |
| 0.8666666666666667 | 0 |
| 0.8673611111111111 | 0 |
| 0.8680555555555555 | 0 |
| 0.86875 | 0 |
| 0.8694444444444445 | 0 |
| 0.8701388888888889 | 0 |
| 0.8708333333333332 | 0 |
| 0.8715277777777778 | 0 |
| 0.8722222222222222 | 0 |
| 0.8729166666666667 | 0 |
| 0.873611111111111 | 0 |
| 0.8743055555555556 | 0 |
| 0.875 | 0 |
| 0.8756944444444444 | 0 |
| 0.876388888888889 | 0 |
| 0.8770833333333333 | 0 |
| 0.8777777777777778 | 0 |
| 0.8784722222222222 | 0 |
| 0.8791666666666668 | 0 |
| 0.8798611111111111 | 0 |
| 0.8805555555555555 | 0 |
| 0.88125 | 0 |
| 0.8819444444444445 | 0 |
| 0.8826388888888889 | 0 |
| 0.8833333333333333 | 0 |
| 0.8840277777777777 | 0 |
| 0.8847222222222223 | 0 |
| 0.8854166666666666 | 0 |
| 0.8861111111111111 | 0 |
| 0.8868055555555556 | 0 |
| 0.8875000000000001 | 0 |
| 0.8881944444444444 | 0 |
| 0.8888888888888888 | 0 |
| 0.8895833333333334 | 0 |
| 0.8902777777777778 | 0 |
| 0.8909722222222222 | 0 |
| 0.8916666666666666 | 0 |
| 0.8923611111111112 | 0 |
| 0.8930555555555556 | 0 |
| 0.8937499999999999 | 0 |
| 0.8944444444444444 | 0 |
| 0.8951388888888889 | 0 |
| 0.8958333333333334 | 0 |
| 0.8965277777777777 | 0 |
| 0.8972222222222223 | 0 |
| 0.8979166666666667 | 0 |
| 0.8986111111111111 | 0 |
| 0.8993055555555555 | 0 |
| 0.9 | 0 |
| 0.9006944444444445 | 0 |
| 0.9013888888888889 | 0 |
| 0.9020833333333332 | 0 |
| 0.9027777777777778 | 0 |
| 0.9034722222222222 | 0 |
| 0.9041666666666667 | 0 |
| 0.904861111111111 | 0 |
| 0.9055555555555556 | 0 |
| 0.90625 | 0 |
| 0.9069444444444444 | 0 |
| 0.907638888888889 | 0 |
| 0.9083333333333333 | 0 |
| 0.9090277777777778 | 0 |
| 0.9097222222222222 | 0 |
| 0.9104166666666668 | 0 |
| 0.9111111111111111 | 0 |
| 0.9118055555555555 | 0 |
| 0.9125 | 0 |
| 0.9131944444444445 | 0 |
| 0.9138888888888889 | 0 |
| 0.9145833333333333 | 0 |
| 0.9152777777777777 | 0 |
| 0.9159722222222223 | 0 |
| 0.9166666666666666 | 0 |
| 0.9173611111111111 | 0 |
| 0.9180555555555556 | 0 |
| 0.9187500000000001 | 0 |
| 0.9194444444444444 | 0 |
| 0.9201388888888888 | 0 |
| 0.9208333333333334 | 0 |
| 0.9215277777777778 | 0 |
| 0.9222222222222222 | 0 |
| 0.9229166666666666 | 0 |
| 0.9236111111111112 | 0 |
| 0.9243055555555556 | 0 |
| 0.9249999999999999 | 0 |
| 0.9256944444444444 | 0 |
| 0.9263888888888889 | 0 |
| 0.9270833333333334 | 0 |
| 0.9277777777777777 | 0 |
| 0.9284722222222223 | 0 |
| 0.9291666666666667 | 0 |
| 0.9298611111111111 | 0 |
| 0.9305555555555555 | 0 |
| 0.93125 | 0 |
| 0.9319444444444445 | 0 |
| 0.9326388888888889 | 0 |
| 0.9333333333333332 | 0 |
| 0.9340277777777778 | 0 |
| 0.9347222222222222 | 0 |
| 0.9354166666666667 | 0 |
| 0.936111111111111 | 0 |
| 0.9368055555555556 | 0 |
| 0.9375 | 0 |
| 0.9381944444444444 | 0 |
| 0.938888888888889 | 0 |
| 0.9395833333333333 | 0 |
| 0.9402777777777778 | 0 |
| 0.9409722222222222 | 0 |
| 0.9416666666666668 | 0 |
| 0.9423611111111111 | 0 |
| 0.9430555555555555 | 0 |
| 0.94375 | 0 |
| 0.9444444444444445 | 0 |
| 0.9451388888888889 | 0 |
| 0.9458333333333333 | 0 |
| 0.9465277777777777 | 0 |
| 0.9472222222222223 | 0 |
| 0.9479166666666666 | 0 |
| 0.9486111111111111 | 0 |
| 0.9493055555555556 | 0 |
| 0.9500000000000001 | 0 |
| 0.9506944444444444 | 0 |
| 0.9513888888888888 | 0 |
| 0.9520833333333334 | 0 |
| 0.9527777777777778 | 0 |
| 0.9534722222222222 | 0 |
| 0.9541666666666666 | 0 |
| 0.9548611111111112 | 0 |
| 0.9555555555555556 | 0 |
| 0.9562499999999999 | 0 |
| 0.9569444444444444 | 0 |
| 0.9576388888888889 | 0 |
| 0.9583333333333334 | 0 |
| 0.9590277777777777 | 0 |
| 0.9597222222222223 | 0 |
| 0.9604166666666667 | 0 |
| 0.9611111111111111 | 0 |
| 0.9618055555555555 | 0 |
| 0.9625 | 0 |
| 0.9631944444444445 | 0 |
| 0.9638888888888889 | 0 |
| 0.9645833333333332 | 0 |
| 0.9652777777777778 | 0 |
| 0.9659722222222222 | 0 |
| 0.9666666666666667 | 0 |
| 0.967361111111111 | 0 |
| 0.9680555555555556 | 0 |
| 0.96875 | 0 |
| 0.9694444444444444 | 0 |
| 0.970138888888889 | 0 |
| 0.9708333333333333 | 0 |
| 0.9715277777777778 | 0 |
| 0.9722222222222222 | 0 |
| 0.9729166666666668 | 0 |
| 0.9736111111111111 | 0 |
| 0.9743055555555555 | 0 |
| 0.975 | 0 |
| 0.9756944444444445 | 0 |
| 0.9763888888888889 | 0 |
| 0.9770833333333333 | 0 |
| 0.9777777777777777 | 0 |
| 0.9784722222222223 | 0 |
| 0.9791666666666666 | 0 |
| 0.9798611111111111 | 0 |
| 0.9805555555555556 | 0 |
| 0.9812500000000001 | 0 |
| 0.9819444444444444 | 0 |
| 0.9826388888888888 | 0 |
| 0.9833333333333334 | 0 |
| 0.9840277777777778 | 0 |
| 0.9847222222222222 | 0 |
| 0.9854166666666666 | 0 |
| 0.9861111111111112 | 0 |
| 0.9868055555555556 | 0 |
| 0.9874999999999999 | 0 |
| 0.9881944444444444 | 0 |
| 0.9888888888888889 | 0 |
| 0.9895833333333334 | 0 |
| 0.9902777777777777 | 0 |
| 0.9909722222222223 | 0 |
| 0.9916666666666667 | 0 |
| 0.9923611111111111 | 0 |
| 0.9930555555555555 | 0 |
| 0.99375 | 0 |
| 0.9944444444444445 | 0 |
| 0.9951388888888889 | 0 |
| 0.9958333333333332 | 0 |
| 0.9965277777777778 | 0 |
| 0.9972222222222222 | 0 |
| 0.9979166666666667 | 0 |
| 0.998611111111111 | 0 |
| 0.9993055555555556 | 0 |